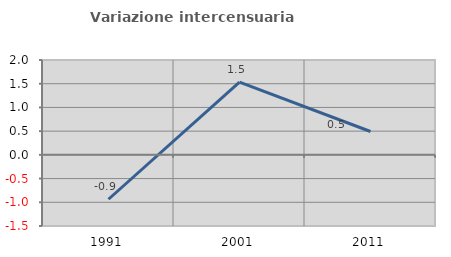
| Category | Variazione intercensuaria annua |
|---|---|
| 1991.0 | -0.936 |
| 2001.0 | 1.533 |
| 2011.0 | 0.493 |